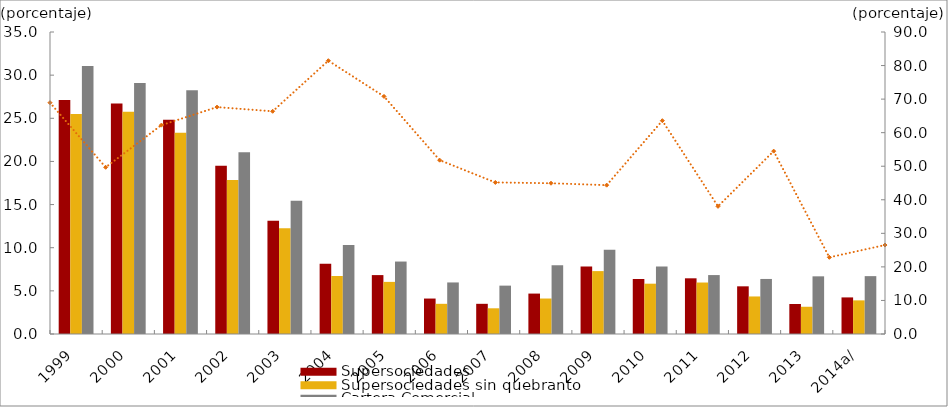
| Category | Supersociedades | Supersociedades sin quebranto | Cartera Comercial |
|---|---|---|---|
| 1999 | 27.121 | 25.508 | 31.052 |
| 2000 | 26.711 | 25.767 | 29.104 |
| 2001 | 24.839 | 23.315 | 28.253 |
| 2002 | 19.506 | 17.861 | 21.052 |
| 2003 | 13.127 | 12.266 | 15.443 |
| 2004 | 8.146 | 6.723 | 10.303 |
| 2005 | 6.826 | 6.04 | 8.397 |
| 2006 | 4.109 | 3.498 | 5.975 |
| 2007 | 3.499 | 2.98 | 5.605 |
| 2008 | 4.685 | 4.112 | 7.975 |
| 2009 | 7.82 | 7.29 | 9.77 |
| 2010 | 6.372 | 5.831 | 7.817 |
| 2011 | 6.454 | 5.966 | 6.829 |
| 2012 | 5.525 | 4.351 | 6.379 |
| 2013 | 3.478 | 3.157 | 6.683 |
| 2014a/ | 4.24 | 3.897 | 6.707 |